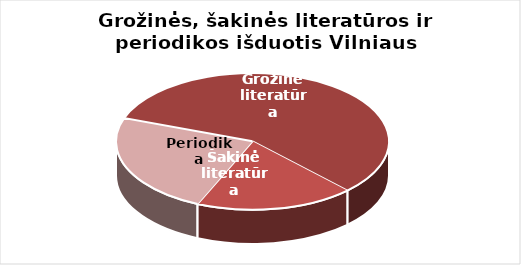
| Category | Series 0 |
|---|---|
| Grožinė literatūra | 1320788 |
| Šakinė literatūra | 433872 |
| Periodika | 553197 |